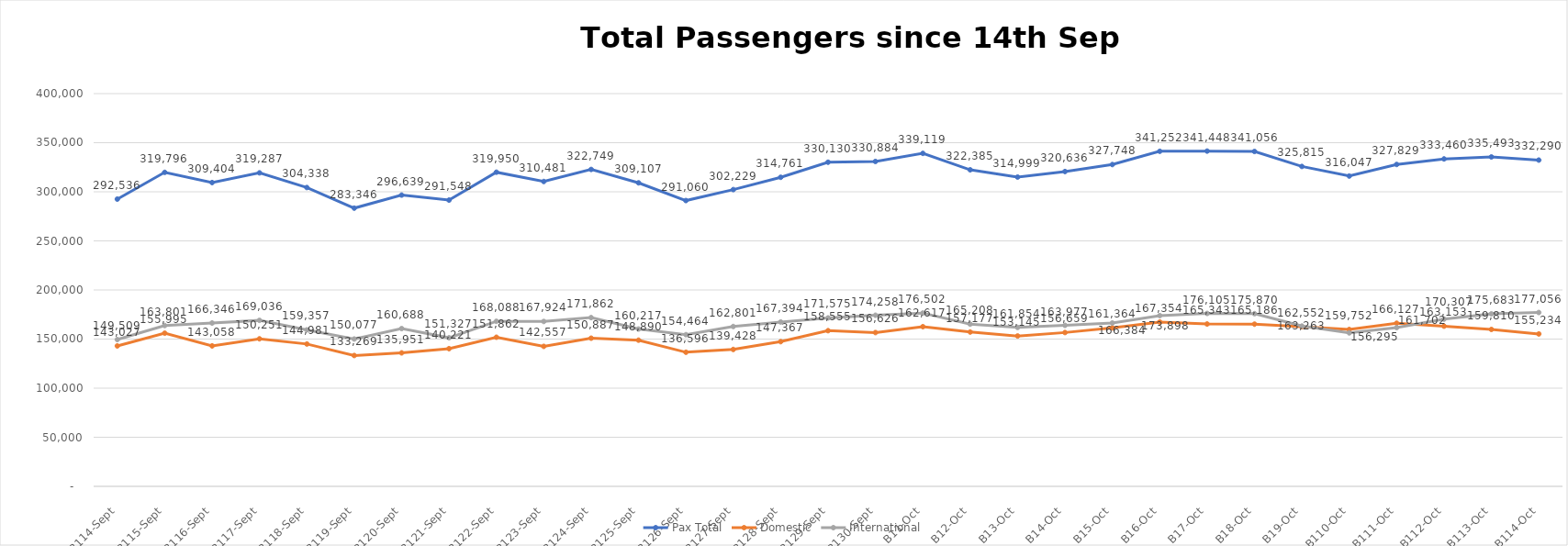
| Category | Pax Total | Domestic | International |
|---|---|---|---|
| 2023-09-14 | 292536 | 143027 | 149509 |
| 2023-09-15 | 319796 | 155995 | 163801 |
| 2023-09-16 | 309404 | 143058 | 166346 |
| 2023-09-17 | 319287 | 150251 | 169036 |
| 2023-09-18 | 304338 | 144981 | 159357 |
| 2023-09-19 | 283346 | 133269 | 150077 |
| 2023-09-20 | 296639 | 135951 | 160688 |
| 2023-09-21 | 291548 | 140221 | 151327 |
| 2023-09-22 | 319950 | 151862 | 168088 |
| 2023-09-23 | 310481 | 142557 | 167924 |
| 2023-09-24 | 322749 | 150887 | 171862 |
| 2023-09-25 | 309107 | 148890 | 160217 |
| 2023-09-26 | 291060 | 136596 | 154464 |
| 2023-09-27 | 302229 | 139428 | 162801 |
| 2023-09-28 | 314761 | 147367 | 167394 |
| 2023-09-29 | 330130 | 158555 | 171575 |
| 2023-09-30 | 330884 | 156626 | 174258 |
| 2023-10-01 | 339119 | 162617 | 176502 |
| 2023-10-02 | 322385 | 157177 | 165208 |
| 2023-10-03 | 314999 | 153145 | 161854 |
| 2023-10-04 | 320636 | 156659 | 163977 |
| 2023-10-05 | 327748 | 161364 | 166384 |
| 2023-10-06 | 341252 | 167354 | 173898 |
| 2023-10-07 | 341448 | 165343 | 176105 |
| 2023-10-08 | 341056 | 165186 | 175870 |
| 2023-10-09 | 325815 | 162552 | 163263 |
| 2023-10-10 | 316047 | 159752 | 156295 |
| 2023-10-11 | 327829 | 166127 | 161702 |
| 2023-10-12 | 333460 | 163153 | 170307 |
| 2023-10-13 | 335493 | 159810 | 175683 |
| 2023-10-14 | 332290 | 155234 | 177056 |